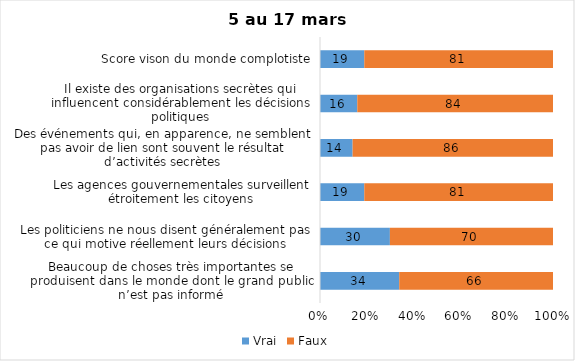
| Category | Vrai | Faux |
|---|---|---|
| Beaucoup de choses très importantes se produisent dans le monde dont le grand public n’est pas informé | 34 | 66 |
| Les politiciens ne nous disent généralement pas ce qui motive réellement leurs décisions | 30 | 70 |
| Les agences gouvernementales surveillent étroitement les citoyens | 19 | 81 |
| Des événements qui, en apparence, ne semblent pas avoir de lien sont souvent le résultat d’activités secrètes | 14 | 86 |
| Il existe des organisations secrètes qui influencent considérablement les décisions politiques | 16 | 84 |
| Score vison du monde complotiste | 19 | 81 |